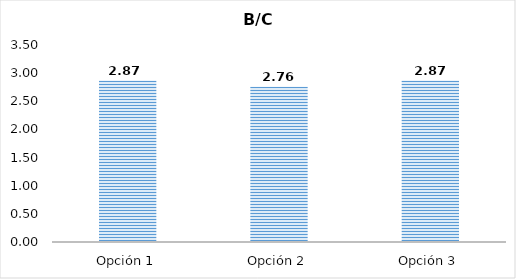
| Category | B/C |
|---|---|
| Opción 1 | 2.871 |
| Opción 2 | 2.756 |
| Opción 3 | 2.871 |